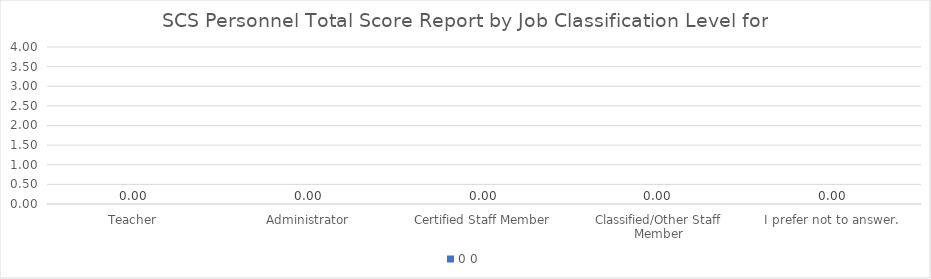
| Category | 0 |
|---|---|
| Teacher | 0 |
| Administrator | 0 |
| Certified Staff Member | 0 |
| Classified/Other Staff Member | 0 |
| I prefer not to answer. | 0 |